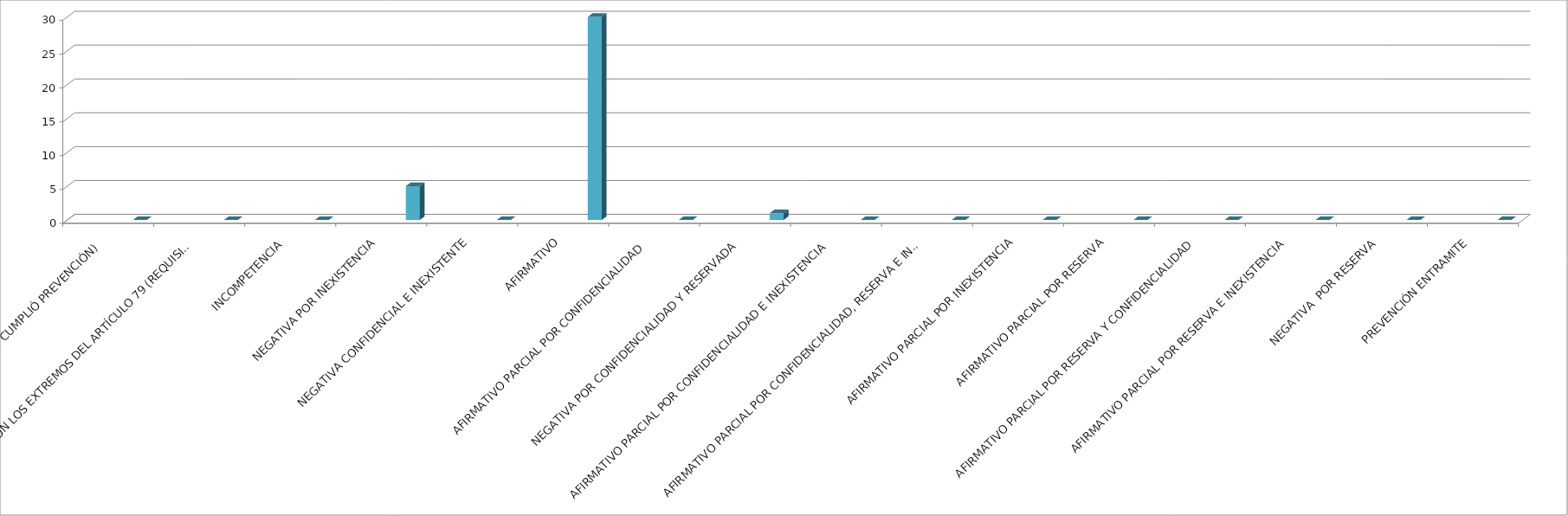
| Category | Series 0 | Series 1 | Series 2 | Series 3 | Series 4 |
|---|---|---|---|---|---|
| SE TIENE POR NO PRESENTADA ( NO CUMPLIÓ PREVENCIÓN) |  |  |  |  | 0 |
| NO CUMPLIO CON LOS EXTREMOS DEL ARTÍCULO 79 (REQUISITOS) |  |  |  |  | 0 |
| INCOMPETENCIA  |  |  |  |  | 0 |
| NEGATIVA POR INEXISTENCIA |  |  |  |  | 5 |
| NEGATIVA CONFIDENCIAL E INEXISTENTE |  |  |  |  | 0 |
| AFIRMATIVO |  |  |  |  | 30 |
| AFIRMATIVO PARCIAL POR CONFIDENCIALIDAD  |  |  |  |  | 0 |
| NEGATIVA POR CONFIDENCIALIDAD Y RESERVADA |  |  |  |  | 1 |
| AFIRMATIVO PARCIAL POR CONFIDENCIALIDAD E INEXISTENCIA |  |  |  |  | 0 |
| AFIRMATIVO PARCIAL POR CONFIDENCIALIDAD, RESERVA E INEXISTENCIA |  |  |  |  | 0 |
| AFIRMATIVO PARCIAL POR INEXISTENCIA |  |  |  |  | 0 |
| AFIRMATIVO PARCIAL POR RESERVA |  |  |  |  | 0 |
| AFIRMATIVO PARCIAL POR RESERVA Y CONFIDENCIALIDAD |  |  |  |  | 0 |
| AFIRMATIVO PARCIAL POR RESERVA E INEXISTENCIA |  |  |  |  | 0 |
| NEGATIVA  POR RESERVA |  |  |  |  | 0 |
| PREVENCIÓN ENTRAMITE |  |  |  |  | 0 |